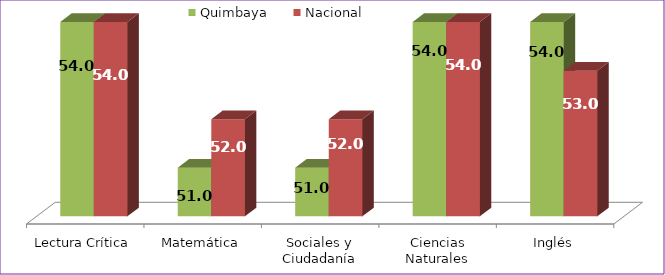
| Category | Quimbaya | Nacional |
|---|---|---|
| Lectura Crítica | 54 | 54 |
| Matemática | 51 | 52 |
| Sociales y Ciudadanía | 51 | 52 |
| Ciencias Naturales | 54 | 54 |
| Inglés | 54 | 53 |